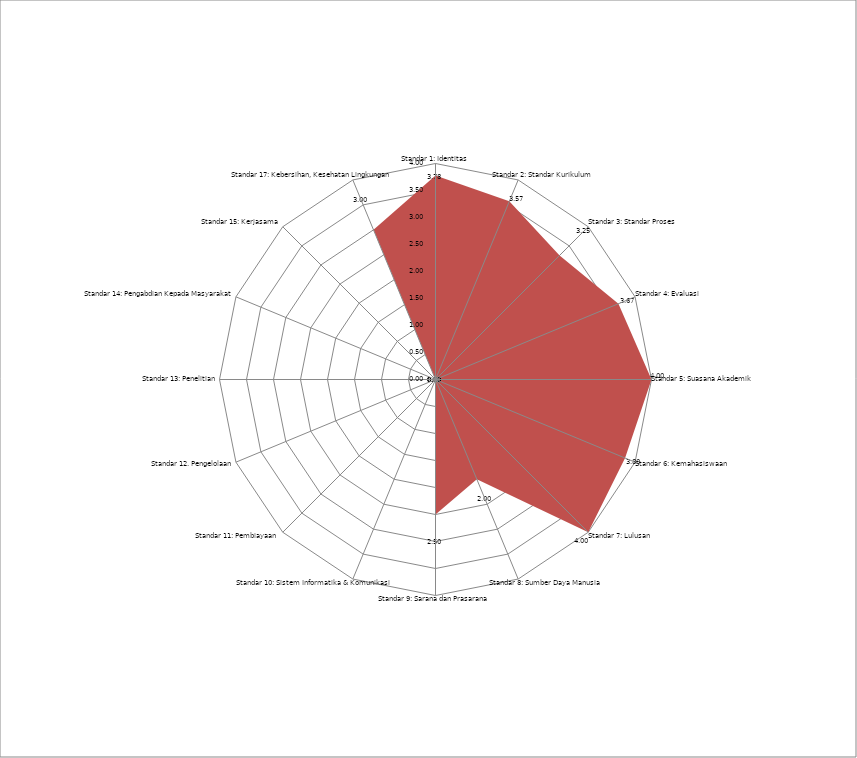
| Category | Nilai per standar |
|---|---|
| Standar 1: Identitas | 3.778 |
| Standar 2: Standar Kurikulum | 3.571 |
| Standar 3: Standar Proses | 3.25 |
| Standar 4: Evaluasi | 3.667 |
| Standar 5: Suasana Akademik | 4 |
| Standar 6: Kemahasiswaan | 3.8 |
| Standar 7: Lulusan  | 4 |
| Standar 8: Sumber Daya Manusia | 2 |
| Standar 9: Sarana dan Prasarana  | 2.5 |
| Standar 10: Sistem Informatika & Komunikasi | 0 |
| Standar 11: Pembiayaan  | 0 |
| Standar 12. Pengelolaan | 3 |
| Standar 13: Penelitian | 0 |
| Standar 14: Pengabdian Kepada Masyarakat | 0 |
| Standar 15: Kerjasama  | 0 |
| Standar 17: Kebersihan, Kesehatan Lingkungan | 3 |